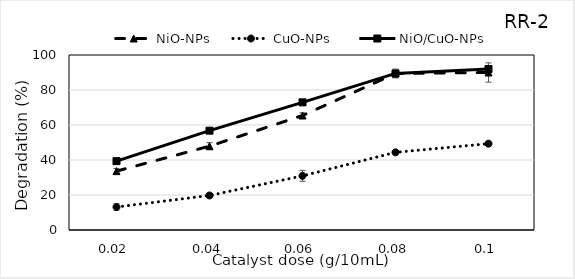
| Category | NiO-NPs | CuO-NPs  | NiO/CuO-NPs |
|---|---|---|---|
| 0.02 | 33.636 | 13.129 | 39.356 |
| 0.04 | 47.912 | 19.728 | 56.751 |
| 0.06 | 65.421 | 30.93 | 72.941 |
| 0.08 | 89.428 | 44.376 | 89.468 |
| 0.1 | 90 | 49.32 | 92 |